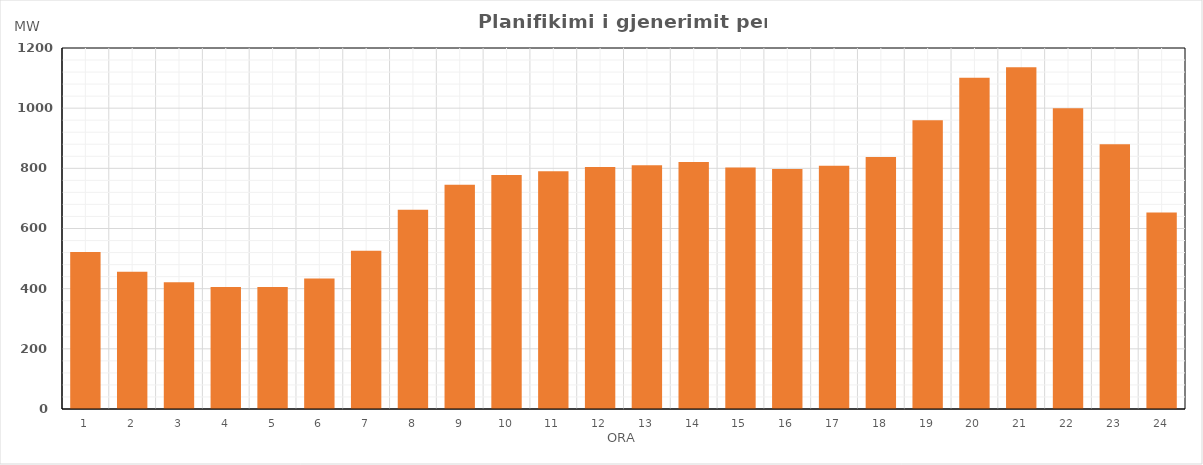
| Category | Max (MW) |
|---|---|
| 0 | 521.91 |
| 1 | 456.22 |
| 2 | 421.42 |
| 3 | 405.61 |
| 4 | 405.48 |
| 5 | 434.18 |
| 6 | 526.14 |
| 7 | 662.15 |
| 8 | 745.26 |
| 9 | 777.67 |
| 10 | 789.98 |
| 11 | 804.59 |
| 12 | 810.15 |
| 13 | 821.19 |
| 14 | 803.09 |
| 15 | 797.37 |
| 16 | 808.68 |
| 17 | 838.06 |
| 18 | 959.63 |
| 19 | 1101.24 |
| 20 | 1136.39 |
| 21 | 1000.08 |
| 22 | 880.14 |
| 23 | 653.34 |